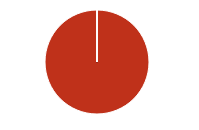
| Category | Total |
|---|---|
| Y | 0 |
| R | 0 |
| T | 0 |
| M | 0 |
| F | 0 |
| N | 236 |